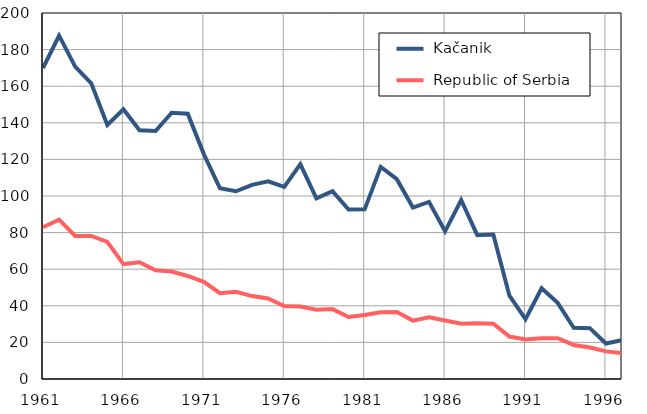
| Category |  Kačanik |  Republic of Serbia |
|---|---|---|
| 1961.0 | 169.9 | 82.9 |
| 1962.0 | 187.6 | 87.1 |
| 1963.0 | 170.7 | 78.2 |
| 1964.0 | 161.6 | 78.2 |
| 1965.0 | 138.8 | 74.9 |
| 1966.0 | 147.4 | 62.8 |
| 1967.0 | 135.9 | 63.8 |
| 1968.0 | 135.5 | 59.4 |
| 1969.0 | 145.5 | 58.7 |
| 1970.0 | 145 | 56.3 |
| 1971.0 | 122.9 | 53.1 |
| 1972.0 | 104.2 | 46.9 |
| 1973.0 | 102.6 | 47.7 |
| 1974.0 | 106.1 | 45.3 |
| 1975.0 | 108 | 44 |
| 1976.0 | 105 | 39.9 |
| 1977.0 | 117.4 | 39.6 |
| 1978.0 | 98.7 | 37.8 |
| 1979.0 | 102.6 | 38.2 |
| 1980.0 | 92.6 | 33.9 |
| 1981.0 | 92.7 | 35 |
| 1982.0 | 115.9 | 36.5 |
| 1983.0 | 109.2 | 36.6 |
| 1984.0 | 93.7 | 31.9 |
| 1985.0 | 96.8 | 33.7 |
| 1986.0 | 80.7 | 32 |
| 1987.0 | 97.8 | 30.2 |
| 1988.0 | 78.6 | 30.5 |
| 1989.0 | 78.9 | 30.2 |
| 1990.0 | 45.5 | 23.2 |
| 1991.0 | 32.7 | 21.6 |
| 1992.0 | 49.6 | 22.3 |
| 1993.0 | 41.6 | 22.3 |
| 1994.0 | 28 | 18.6 |
| 1995.0 | 27.8 | 17.2 |
| 1996.0 | 19.4 | 15.1 |
| 1997.0 | 21.2 | 14.2 |